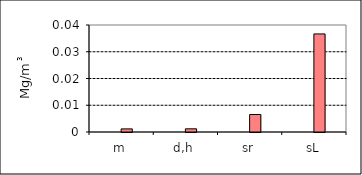
| Category | Series 1 | Series 0 | Series 5 | Series 6 |
|---|---|---|---|---|
| m |  |  | 0.001 |  |
| d,h |  |  | 0.001 |  |
| sr |  |  | 0.007 |  |
| sL |  |  | 0.037 |  |